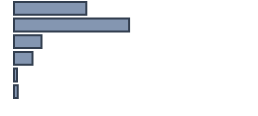
| Category | Percentatge |
|---|---|
| 0 | 30.13 |
| 1 | 47.957 |
| 2 | 11.435 |
| 3 | 7.696 |
| 4 | 1.217 |
| 5 | 1.565 |